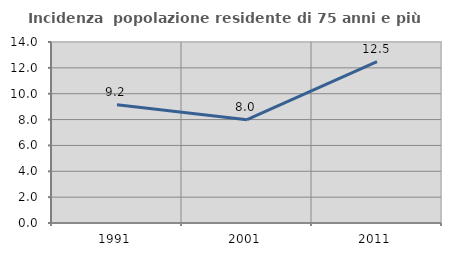
| Category | Incidenza  popolazione residente di 75 anni e più |
|---|---|
| 1991.0 | 9.15 |
| 2001.0 | 7.994 |
| 2011.0 | 12.482 |